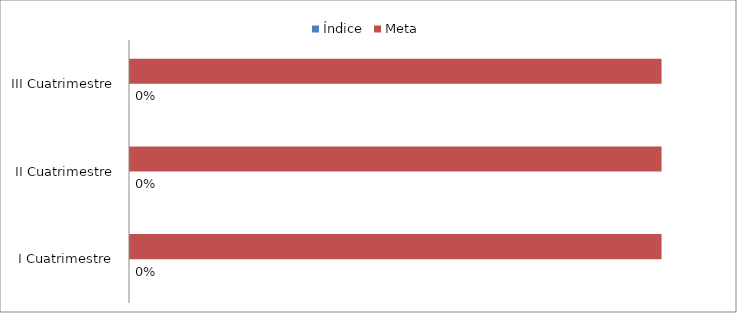
| Category | Índice | Meta |
|---|---|---|
| I Cuatrimestre | 0 | 0.08 |
| II Cuatrimestre | 0 | 0.08 |
| III Cuatrimestre | 0 | 0.08 |